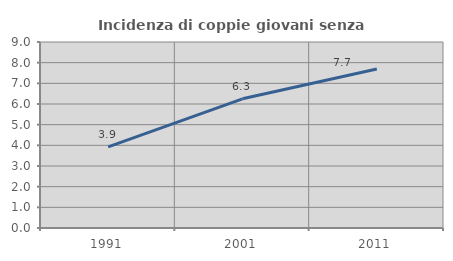
| Category | Incidenza di coppie giovani senza figli |
|---|---|
| 1991.0 | 3.922 |
| 2001.0 | 6.25 |
| 2011.0 | 7.692 |